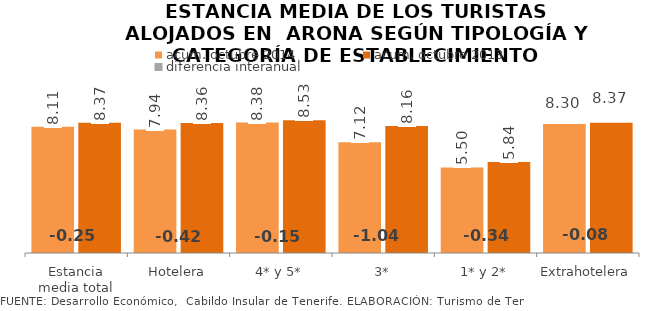
| Category | acum. octubre 2014 | acum. octubre 2013 |
|---|---|---|
| Estancia media total | 8.113 | 8.367 |
| Hotelera | 7.937 | 8.36 |
| 4* y 5* | 8.385 | 8.532 |
| 3* | 7.124 | 8.164 |
| 1* y 2* | 5.504 | 5.843 |
| Extrahotelera | 8.296 | 8.374 |